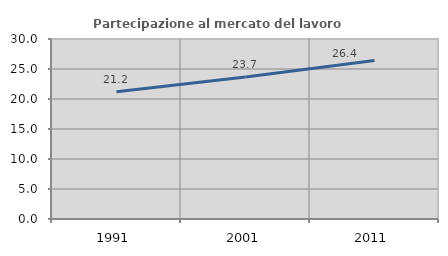
| Category | Partecipazione al mercato del lavoro  femminile |
|---|---|
| 1991.0 | 21.194 |
| 2001.0 | 23.656 |
| 2011.0 | 26.4 |